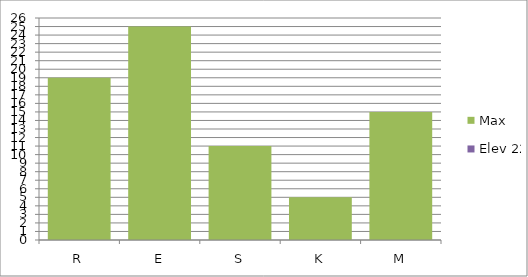
| Category | Max | Elev 22 |
|---|---|---|
| R | 19 | 0 |
| E | 25 | 0 |
| S | 11 | 0 |
| K | 5 | 0 |
| M | 15 | 0 |